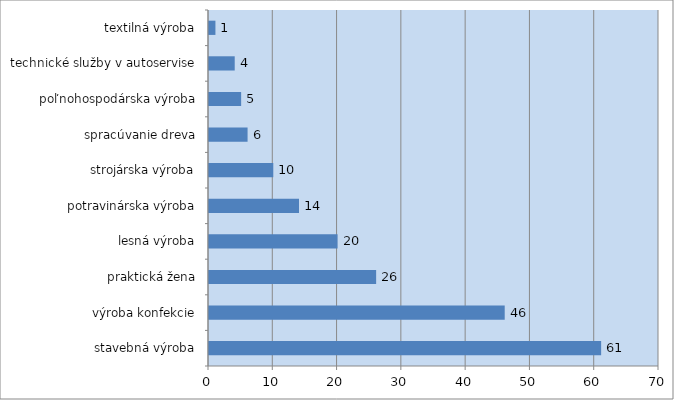
| Category | Series 0 |
|---|---|
| stavebná výroba | 61 |
| výroba konfekcie | 46 |
| praktická žena | 26 |
| lesná výroba | 20 |
| potravinárska výroba | 14 |
| strojárska výroba | 10 |
| spracúvanie dreva | 6 |
| poľnohospodárska výroba | 5 |
| technické služby v autoservise | 4 |
| textilná výroba | 1 |